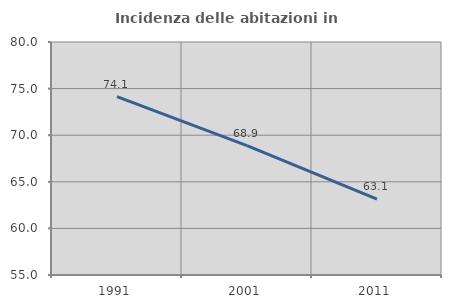
| Category | Incidenza delle abitazioni in proprietà  |
|---|---|
| 1991.0 | 74.142 |
| 2001.0 | 68.882 |
| 2011.0 | 63.143 |